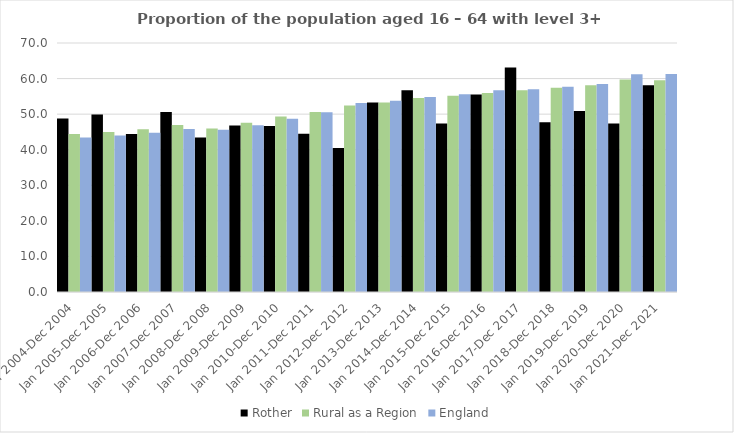
| Category | Rother | Rural as a Region | England |
|---|---|---|---|
| Jan 2004-Dec 2004 | 48.8 | 44.405 | 43.4 |
| Jan 2005-Dec 2005 | 49.9 | 44.973 | 44 |
| Jan 2006-Dec 2006 | 44.4 | 45.774 | 44.8 |
| Jan 2007-Dec 2007 | 50.6 | 46.968 | 45.8 |
| Jan 2008-Dec 2008 | 43.4 | 45.964 | 45.6 |
| Jan 2009-Dec 2009 | 46.8 | 47.59 | 46.9 |
| Jan 2010-Dec 2010 | 46.7 | 49.362 | 48.7 |
| Jan 2011-Dec 2011 | 44.5 | 50.602 | 50.5 |
| Jan 2012-Dec 2012 | 40.5 | 52.439 | 53.1 |
| Jan 2013-Dec 2013 | 53.3 | 53.276 | 53.8 |
| Jan 2014-Dec 2014 | 56.7 | 54.57 | 54.8 |
| Jan 2015-Dec 2015 | 47.4 | 55.16 | 55.6 |
| Jan 2016-Dec 2016 | 55.5 | 55.941 | 56.7 |
| Jan 2017-Dec 2017 | 63.1 | 56.689 | 57 |
| Jan 2018-Dec 2018 | 47.7 | 57.389 | 57.7 |
| Jan 2019-Dec 2019 | 50.9 | 58.147 | 58.5 |
| Jan 2020-Dec 2020 | 47.4 | 59.771 | 61.2 |
| Jan 2021-Dec 2021 | 58.1 | 59.54 | 61.3 |